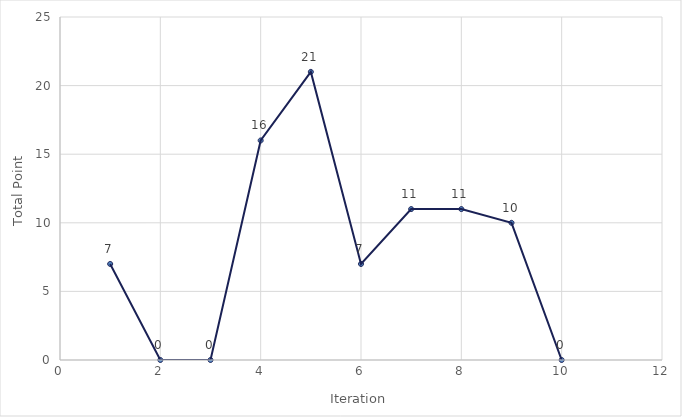
| Category | Total Points |
|---|---|
| 1.0 | 7 |
| 2.0 | 0 |
| 3.0 | 0 |
| 4.0 | 16 |
| 5.0 | 21 |
| 6.0 | 7 |
| 7.0 | 11 |
| 8.0 | 11 |
| 9.0 | 10 |
| 10.0 | 0 |